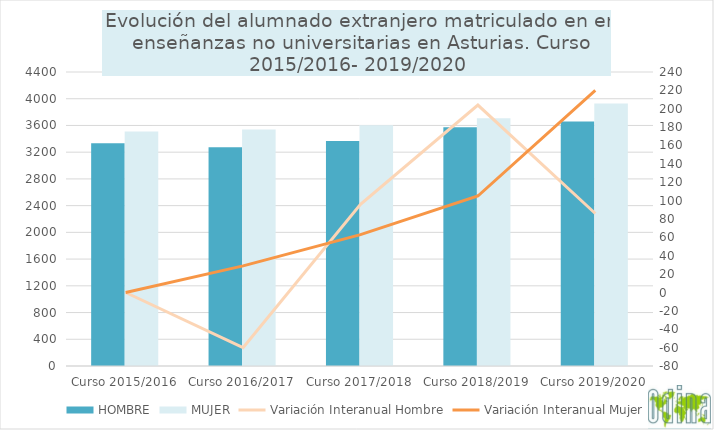
| Category | HOMBRE | MUJER |
|---|---|---|
| Curso 2015/2016 | 3333 | 3511 |
| Curso 2016/2017 | 3273 | 3540 |
| Curso 2017/2018 | 3369 | 3603 |
| Curso 2018/2019 | 3573 | 3708 |
| Curso 2019/2020 | 3659 | 3928 |